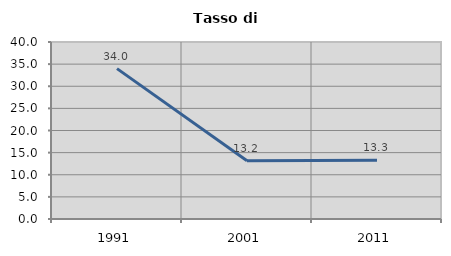
| Category | Tasso di disoccupazione   |
|---|---|
| 1991.0 | 33.981 |
| 2001.0 | 13.165 |
| 2011.0 | 13.271 |